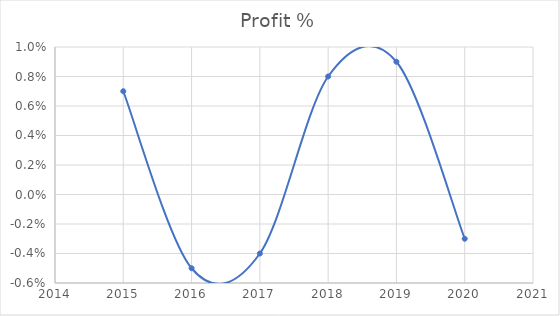
| Category | Profit % |
|---|---|
| 2015.0 | 0.007 |
| 2016.0 | -0.005 |
| 2017.0 | -0.004 |
| 2018.0 | 0.008 |
| 2019.0 | 0.009 |
| 2020.0 | -0.003 |